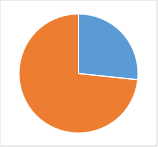
| Category | Series 0 |
|---|---|
| 0 | 0.229 |
| 1 | 0.629 |
| 2 | 0 |